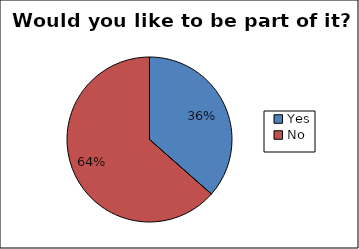
| Category | Series 0 |
|---|---|
| Yes | 0.365 |
| No | 0.635 |